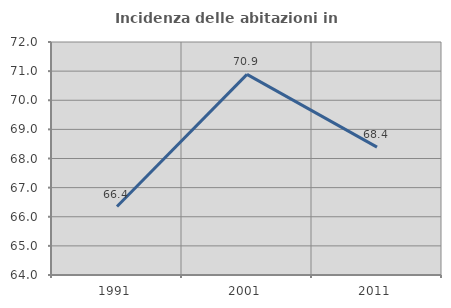
| Category | Incidenza delle abitazioni in proprietà  |
|---|---|
| 1991.0 | 66.351 |
| 2001.0 | 70.887 |
| 2011.0 | 68.391 |